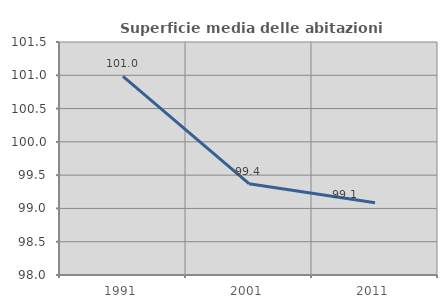
| Category | Superficie media delle abitazioni occupate |
|---|---|
| 1991.0 | 100.982 |
| 2001.0 | 99.371 |
| 2011.0 | 99.086 |